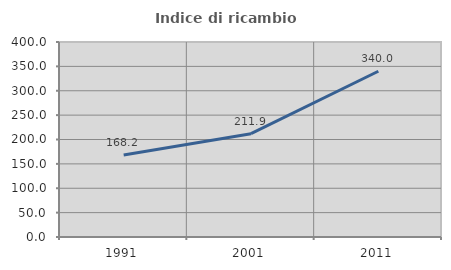
| Category | Indice di ricambio occupazionale  |
|---|---|
| 1991.0 | 168.249 |
| 2001.0 | 211.888 |
| 2011.0 | 340.033 |